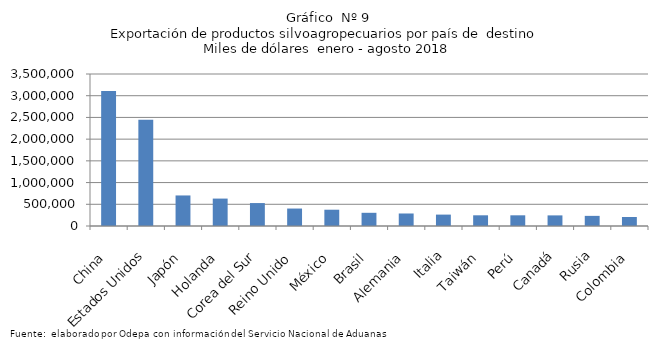
| Category | Series 0 |
|---|---|
| China | 3109963.811 |
| Estados Unidos | 2446186.992 |
| Japón | 703354.422 |
| Holanda | 631348.111 |
| Corea del Sur | 527957.425 |
| Reino Unido | 401975.25 |
| México | 374966.922 |
| Brasil | 303912.539 |
| Alemania | 288063.97 |
| Italia | 262422.206 |
| Taiwán | 246361.623 |
| Perú | 246116.268 |
| Canadá | 244408.97 |
| Rusia | 233323.634 |
| Colombia | 207460.372 |